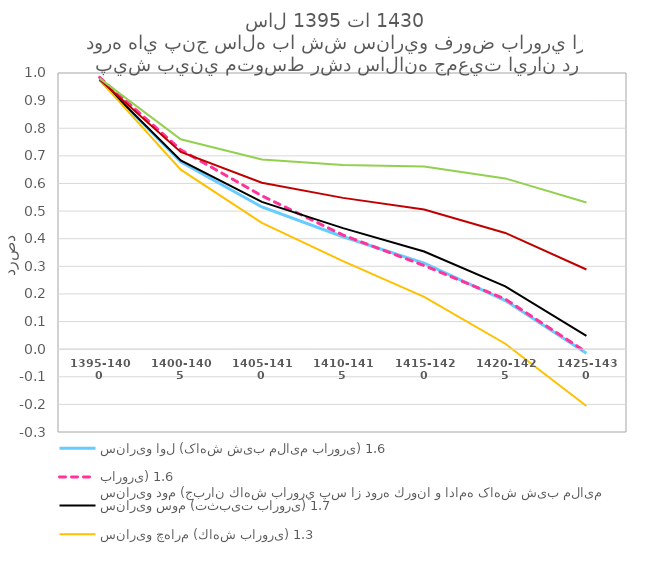
| Category | سناریو اول (کاهش شیب ملایم باروری) 1.6 | سناریو دوم (جبران كاهش باروري پس از دوره كرونا و ادامه کاهش شیب ملایم باروری) 1.6 | سناریو سوم (تثبیت باروری) 1.7 | سناریو چهارم (كاهش باروری) 1.3 | سناریو پنجم افزایش باروری) 2.1 | سناریو ششم افزایش باروری) 2.5 |
|---|---|---|---|---|---|---|
| 1395-1400 | 0.976 | 0.984 | 0.976 | 0.975 | 0.976 | 0.98 |
| 1400-1405 | 0.678 | 0.722 | 0.683 | 0.65 | 0.714 | 0.76 |
| 1405-1410 | 0.515 | 0.555 | 0.533 | 0.457 | 0.603 | 0.687 |
| 1410-1415 | 0.407 | 0.413 | 0.438 | 0.319 | 0.548 | 0.667 |
| 1415-1420 | 0.311 | 0.303 | 0.354 | 0.189 | 0.506 | 0.661 |
| 1420-1425 | 0.176 | 0.181 | 0.228 | 0.02 | 0.421 | 0.618 |
| 1425-1430 | -0.015 | -0.011 | 0.048 | -0.206 | 0.288 | 0.531 |